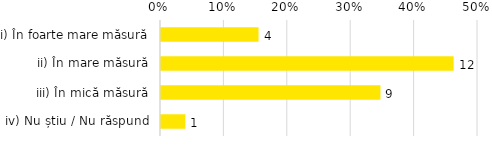
| Category | Total |
|---|---|
| i) În foarte mare măsură | 0.154 |
| ii) În mare măsură | 0.462 |
| iii) În mică măsură | 0.346 |
| iv) Nu știu / Nu răspund | 0.038 |